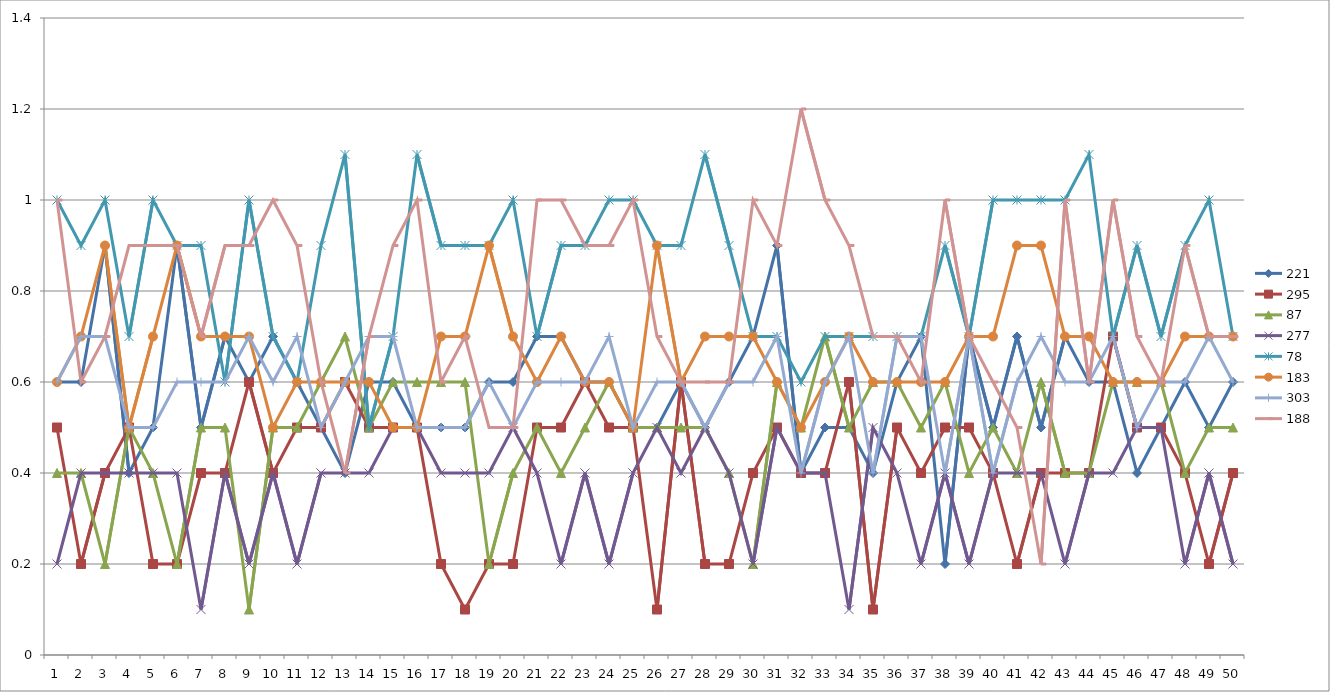
| Category | 221 | 295 | 87 | 277 | 78 | 183 | 303 | 188 |
|---|---|---|---|---|---|---|---|---|
| 0 | 0.6 | 0.5 | 0.4 | 0.2 | 1 | 0.6 | 0.6 | 1 |
| 1 | 0.6 | 0.2 | 0.4 | 0.4 | 0.9 | 0.7 | 0.7 | 0.6 |
| 2 | 0.9 | 0.4 | 0.2 | 0.4 | 1 | 0.9 | 0.7 | 0.7 |
| 3 | 0.4 | 0.5 | 0.5 | 0.4 | 0.7 | 0.5 | 0.5 | 0.9 |
| 4 | 0.5 | 0.2 | 0.4 | 0.4 | 1 | 0.7 | 0.5 | 0.9 |
| 5 | 0.9 | 0.2 | 0.2 | 0.4 | 0.9 | 0.9 | 0.6 | 0.9 |
| 6 | 0.5 | 0.4 | 0.5 | 0.1 | 0.9 | 0.7 | 0.6 | 0.7 |
| 7 | 0.7 | 0.4 | 0.5 | 0.4 | 0.6 | 0.7 | 0.6 | 0.9 |
| 8 | 0.6 | 0.6 | 0.1 | 0.2 | 1 | 0.7 | 0.7 | 0.9 |
| 9 | 0.7 | 0.4 | 0.5 | 0.4 | 0.7 | 0.5 | 0.6 | 1 |
| 10 | 0.6 | 0.5 | 0.5 | 0.2 | 0.6 | 0.6 | 0.7 | 0.9 |
| 11 | 0.5 | 0.5 | 0.6 | 0.4 | 0.9 | 0.6 | 0.5 | 0.6 |
| 12 | 0.4 | 0.6 | 0.7 | 0.4 | 1.1 | 0.6 | 0.6 | 0.4 |
| 13 | 0.6 | 0.5 | 0.5 | 0.4 | 0.5 | 0.6 | 0.7 | 0.7 |
| 14 | 0.6 | 0.5 | 0.6 | 0.5 | 0.7 | 0.5 | 0.7 | 0.9 |
| 15 | 0.5 | 0.5 | 0.6 | 0.5 | 1.1 | 0.5 | 0.5 | 1 |
| 16 | 0.5 | 0.2 | 0.6 | 0.4 | 0.9 | 0.7 | 0.5 | 0.6 |
| 17 | 0.5 | 0.1 | 0.6 | 0.4 | 0.9 | 0.7 | 0.5 | 0.7 |
| 18 | 0.6 | 0.2 | 0.2 | 0.4 | 0.9 | 0.9 | 0.6 | 0.5 |
| 19 | 0.6 | 0.2 | 0.4 | 0.5 | 1 | 0.7 | 0.5 | 0.5 |
| 20 | 0.7 | 0.5 | 0.5 | 0.4 | 0.7 | 0.6 | 0.6 | 1 |
| 21 | 0.7 | 0.5 | 0.4 | 0.2 | 0.9 | 0.7 | 0.6 | 1 |
| 22 | 0.6 | 0.6 | 0.5 | 0.4 | 0.9 | 0.6 | 0.6 | 0.9 |
| 23 | 0.6 | 0.5 | 0.6 | 0.2 | 1 | 0.6 | 0.7 | 0.9 |
| 24 | 0.5 | 0.5 | 0.5 | 0.4 | 1 | 0.5 | 0.5 | 1 |
| 25 | 0.5 | 0.1 | 0.5 | 0.5 | 0.9 | 0.9 | 0.6 | 0.7 |
| 26 | 0.6 | 0.6 | 0.5 | 0.4 | 0.9 | 0.6 | 0.6 | 0.6 |
| 27 | 0.5 | 0.2 | 0.5 | 0.5 | 1.1 | 0.7 | 0.5 | 0.6 |
| 28 | 0.6 | 0.2 | 0.4 | 0.4 | 0.9 | 0.7 | 0.6 | 0.6 |
| 29 | 0.7 | 0.4 | 0.2 | 0.2 | 0.7 | 0.7 | 0.6 | 1 |
| 30 | 0.9 | 0.5 | 0.6 | 0.5 | 0.7 | 0.6 | 0.7 | 0.9 |
| 31 | 0.4 | 0.4 | 0.5 | 0.4 | 0.6 | 0.5 | 0.4 | 1.2 |
| 32 | 0.5 | 0.4 | 0.7 | 0.4 | 0.7 | 0.6 | 0.6 | 1 |
| 33 | 0.5 | 0.6 | 0.5 | 0.1 | 0.7 | 0.7 | 0.7 | 0.9 |
| 34 | 0.4 | 0.1 | 0.6 | 0.5 | 0.7 | 0.6 | 0.4 | 0.7 |
| 35 | 0.6 | 0.5 | 0.6 | 0.4 | 0.7 | 0.6 | 0.7 | 0.7 |
| 36 | 0.7 | 0.4 | 0.5 | 0.2 | 0.7 | 0.6 | 0.7 | 0.6 |
| 37 | 0.2 | 0.5 | 0.6 | 0.4 | 0.9 | 0.6 | 0.4 | 1 |
| 38 | 0.7 | 0.5 | 0.4 | 0.2 | 0.7 | 0.7 | 0.7 | 0.7 |
| 39 | 0.5 | 0.4 | 0.5 | 0.4 | 1 | 0.7 | 0.4 | 0.6 |
| 40 | 0.7 | 0.2 | 0.4 | 0.4 | 1 | 0.9 | 0.6 | 0.5 |
| 41 | 0.5 | 0.4 | 0.6 | 0.4 | 1 | 0.9 | 0.7 | 0.2 |
| 42 | 0.7 | 0.4 | 0.4 | 0.2 | 1 | 0.7 | 0.6 | 1 |
| 43 | 0.6 | 0.4 | 0.4 | 0.4 | 1.1 | 0.7 | 0.6 | 0.6 |
| 44 | 0.6 | 0.7 | 0.6 | 0.4 | 0.7 | 0.6 | 0.7 | 1 |
| 45 | 0.4 | 0.5 | 0.6 | 0.5 | 0.9 | 0.6 | 0.5 | 0.7 |
| 46 | 0.5 | 0.5 | 0.6 | 0.5 | 0.7 | 0.6 | 0.6 | 0.6 |
| 47 | 0.6 | 0.4 | 0.4 | 0.2 | 0.9 | 0.7 | 0.6 | 0.9 |
| 48 | 0.5 | 0.2 | 0.5 | 0.4 | 1 | 0.7 | 0.7 | 0.7 |
| 49 | 0.6 | 0.4 | 0.5 | 0.2 | 0.7 | 0.7 | 0.6 | 0.7 |